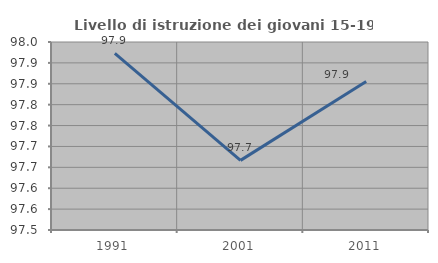
| Category | Livello di istruzione dei giovani 15-19 anni |
|---|---|
| 1991.0 | 97.923 |
| 2001.0 | 97.667 |
| 2011.0 | 97.855 |